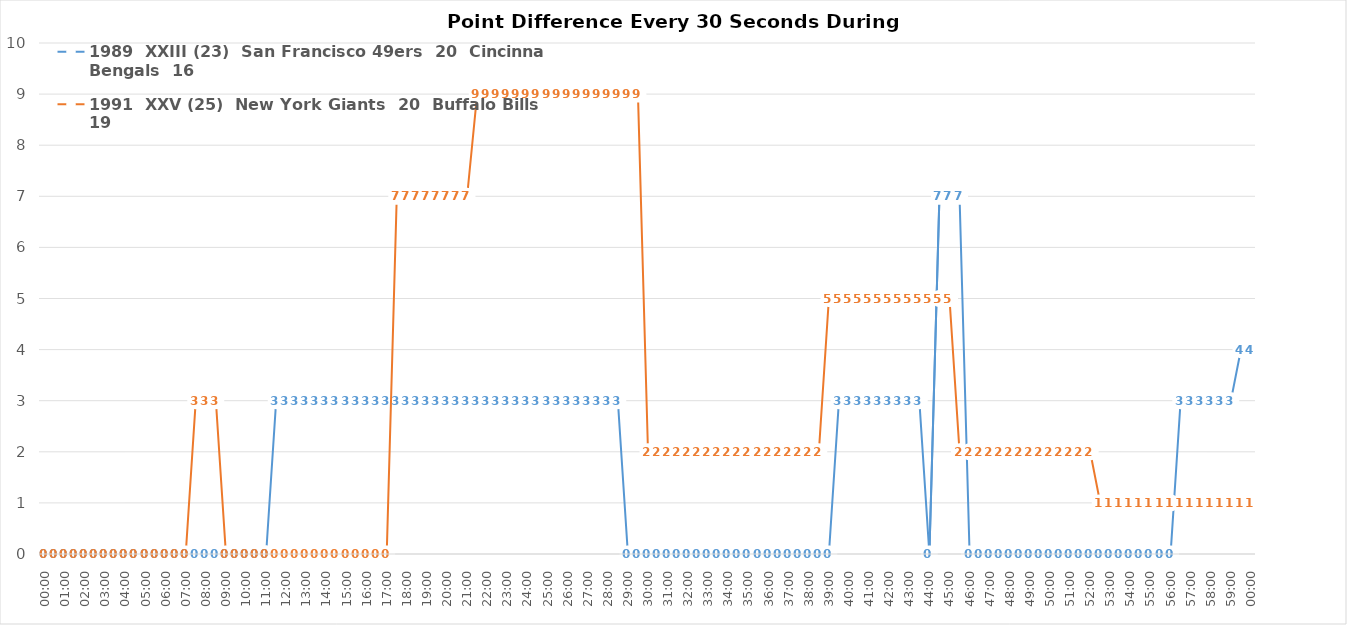
| Category | 1989  XXIII (23)  San Francisco 49ers  20  Cincinnati Bengals  16 | 1991  XXV (25)  New York Giants  20  Buffalo Bills  19 |
|---|---|---|
| 0.0 | 0 | 0 |
| 0.00034722222222222224 | 0 | 0 |
| 0.0006944444444444445 | 0 | 0 |
| 0.0010416666666666667 | 0 | 0 |
| 0.001388888888888889 | 0 | 0 |
| 0.0017361111111111112 | 0 | 0 |
| 0.0020833333333333333 | 0 | 0 |
| 0.0024305555555555556 | 0 | 0 |
| 0.002777777777777778 | 0 | 0 |
| 0.003125 | 0 | 0 |
| 0.0034722222222222225 | 0 | 0 |
| 0.0038194444444444448 | 0 | 0 |
| 0.004166666666666667 | 0 | 0 |
| 0.0045138888888888885 | 0 | 0 |
| 0.00486111111111111 | 0 | 0 |
| 0.005208333333333332 | 0 | 3 |
| 0.005555555555555554 | 0 | 3 |
| 0.005902777777777776 | 0 | 3 |
| 0.006249999999999998 | 0 | 0 |
| 0.00659722222222222 | 0 | 0 |
| 0.0069444444444444415 | 0 | 0 |
| 0.007291666666666663 | 0 | 0 |
| 0.007638888888888885 | 0 | 0 |
| 0.007986111111111107 | 3 | 0 |
| 0.00833333333333333 | 3 | 0 |
| 0.008680555555555552 | 3 | 0 |
| 0.009027777777777775 | 3 | 0 |
| 0.009374999999999998 | 3 | 0 |
| 0.00972222222222222 | 3 | 0 |
| 0.010069444444444443 | 3 | 0 |
| 0.010416666666666666 | 3 | 0 |
| 0.010763888888888889 | 3 | 0 |
| 0.011111111111111112 | 3 | 0 |
| 0.011458333333333334 | 3 | 0 |
| 0.011805555555555557 | 3 | 0 |
| 0.01215277777777778 | 3 | 7 |
| 0.012500000000000002 | 3 | 7 |
| 0.012847222222222225 | 3 | 7 |
| 0.013194444444444448 | 3 | 7 |
| 0.01354166666666667 | 3 | 7 |
| 0.013888888888888893 | 3 | 7 |
| 0.014236111111111116 | 3 | 7 |
| 0.014583333333333339 | 3 | 7 |
| 0.014930555555555561 | 3 | 9 |
| 0.015277777777777784 | 3 | 9 |
| 0.015625000000000007 | 3 | 9 |
| 0.015972222222222228 | 3 | 9 |
| 0.01631944444444445 | 3 | 9 |
| 0.01666666666666667 | 3 | 9 |
| 0.01701388888888889 | 3 | 9 |
| 0.017361111111111112 | 3 | 9 |
| 0.017708333333333333 | 3 | 9 |
| 0.018055555555555554 | 3 | 9 |
| 0.018402777777777775 | 3 | 9 |
| 0.018749999999999996 | 3 | 9 |
| 0.019097222222222217 | 3 | 9 |
| 0.019444444444444438 | 3 | 9 |
| 0.01979166666666666 | 3 | 9 |
| 0.02013888888888888 | 0 | 9 |
| 0.0204861111111111 | 0 | 9 |
| 0.020833333333333322 | 0 | 2 |
| 0.021180555555555543 | 0 | 2 |
| 0.021527777777777764 | 0 | 2 |
| 0.021874999999999985 | 0 | 2 |
| 0.022222222222222206 | 0 | 2 |
| 0.022569444444444427 | 0 | 2 |
| 0.022916666666666648 | 0 | 2 |
| 0.02326388888888887 | 0 | 2 |
| 0.02361111111111109 | 0 | 2 |
| 0.02395833333333331 | 0 | 2 |
| 0.02430555555555553 | 0 | 2 |
| 0.024652777777777753 | 0 | 2 |
| 0.024999999999999974 | 0 | 2 |
| 0.025347222222222195 | 0 | 2 |
| 0.025694444444444416 | 0 | 2 |
| 0.026041666666666637 | 0 | 2 |
| 0.026388888888888858 | 0 | 2 |
| 0.02673611111111108 | 0 | 2 |
| 0.0270833333333333 | 0 | 5 |
| 0.02743055555555552 | 3 | 5 |
| 0.02777777777777774 | 3 | 5 |
| 0.028124999999999963 | 3 | 5 |
| 0.028472222222222184 | 3 | 5 |
| 0.028819444444444405 | 3 | 5 |
| 0.029166666666666625 | 3 | 5 |
| 0.029513888888888846 | 3 | 5 |
| 0.029861111111111067 | 3 | 5 |
| 0.03020833333333329 | 3 | 5 |
| 0.03055555555555551 | 0 | 5 |
| 0.03090277777777773 | 7 | 5 |
| 0.03124999999999995 | 7 | 5 |
| 0.03159722222222217 | 7 | 2 |
| 0.03194444444444439 | 0 | 2 |
| 0.032291666666666614 | 0 | 2 |
| 0.032638888888888835 | 0 | 2 |
| 0.032986111111111056 | 0 | 2 |
| 0.03333333333333328 | 0 | 2 |
| 0.0336805555555555 | 0 | 2 |
| 0.03402777777777772 | 0 | 2 |
| 0.03437499999999994 | 0 | 2 |
| 0.03472222222222216 | 0 | 2 |
| 0.03506944444444438 | 0 | 2 |
| 0.0354166666666666 | 0 | 2 |
| 0.035763888888888824 | 0 | 2 |
| 0.036111111111111045 | 0 | 2 |
| 0.036458333333333266 | 0 | 1 |
| 0.03680555555555549 | 0 | 1 |
| 0.03715277777777771 | 0 | 1 |
| 0.03749999999999993 | 0 | 1 |
| 0.03784722222222215 | 0 | 1 |
| 0.03819444444444437 | 0 | 1 |
| 0.03854166666666659 | 0 | 1 |
| 0.03888888888888881 | 0 | 1 |
| 0.039236111111111034 | 3 | 1 |
| 0.039583333333333255 | 3 | 1 |
| 0.039930555555555476 | 3 | 1 |
| 0.0402777777777777 | 3 | 1 |
| 0.04062499999999992 | 3 | 1 |
| 0.04097222222222214 | 3 | 1 |
| 0.04131944444444436 | 4 | 1 |
| 0.04166666666666658 | 4 | 1 |